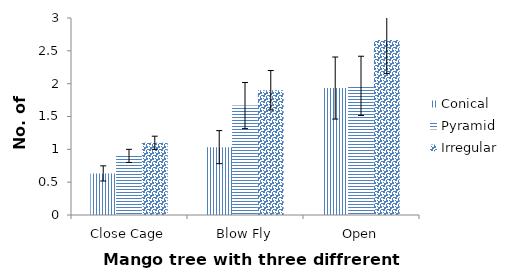
| Category | Conical | Pyramid | Irregular |
|---|---|---|---|
| Close Cage | 0.633 | 0.9 | 1.1 |
| Blow Fly | 1.033 | 1.667 | 1.9 |
| Open | 1.933 | 1.967 | 2.667 |